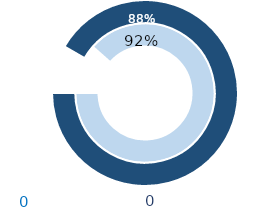
| Category | Series 1 | Series 0 |
|---|---|---|
| 0 | 0.12 | 0.08 |
| 1 | 0.92 | 0.88 |